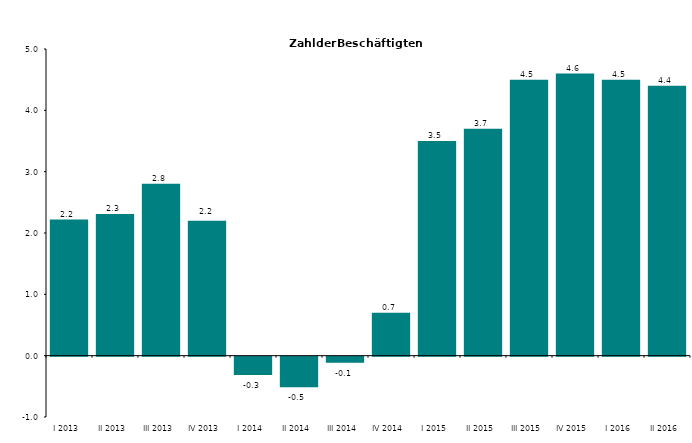
| Category | Series 0 |
|---|---|
| I 2013 | 2.218 |
| II 2013 | 2.309 |
| III 2013 | 2.802 |
| IV 2013 | 2.2 |
| I 2014 | -0.3 |
| II 2014 | -0.5 |
| III 2014 | -0.1 |
| IV 2014 | 0.7 |
| I 2015 | 3.5 |
| II 2015 | 3.7 |
| III 2015 | 4.5 |
| IV 2015 | 4.6 |
| I 2016 | 4.5 |
| II 2016 | 4.4 |